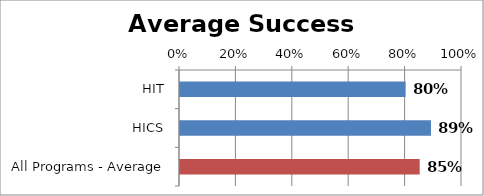
| Category | RetentionRate |
|---|---|
| HIT | 0.8 |
| HICS | 0.89 |
| All Programs - Average | 0.85 |